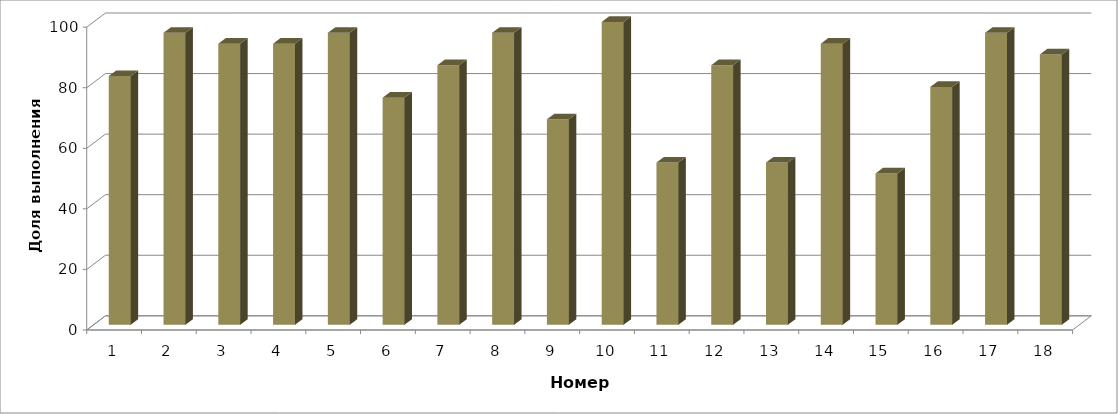
| Category | Доля учащихся полностьювы полнивших задание |
|---|---|
| 1.0 | 82.143 |
| 2.0 | 96.429 |
| 3.0 | 92.857 |
| 4.0 | 92.857 |
| 5.0 | 96.429 |
| 6.0 | 75 |
| 7.0 | 85.714 |
| 8.0 | 96.429 |
| 9.0 | 67.857 |
| 10.0 | 100 |
| 11.0 | 53.571 |
| 12.0 | 85.714 |
| 13.0 | 53.571 |
| 14.0 | 92.857 |
| 15.0 | 50 |
| 16.0 | 78.571 |
| 17.0 | 96.429 |
| 18.0 | 89.286 |